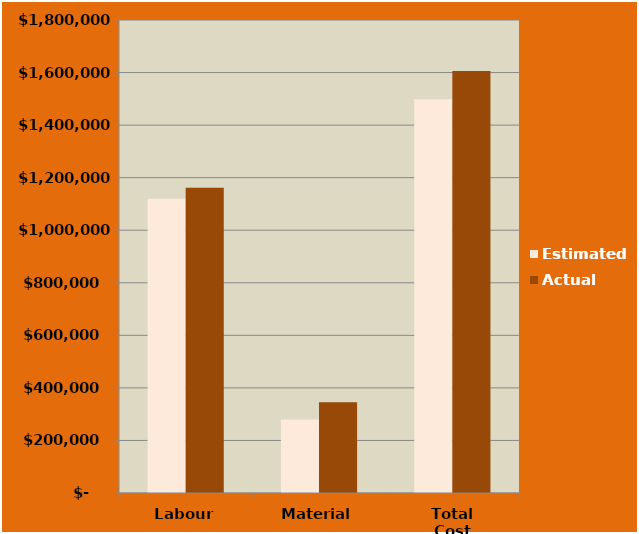
| Category | Estimated | Actual |
|---|---|---|
| Labour | 1120000 | 1162000 |
| Material | 280000 | 345800 |
| Total Cost | 1498000 | 1605800 |